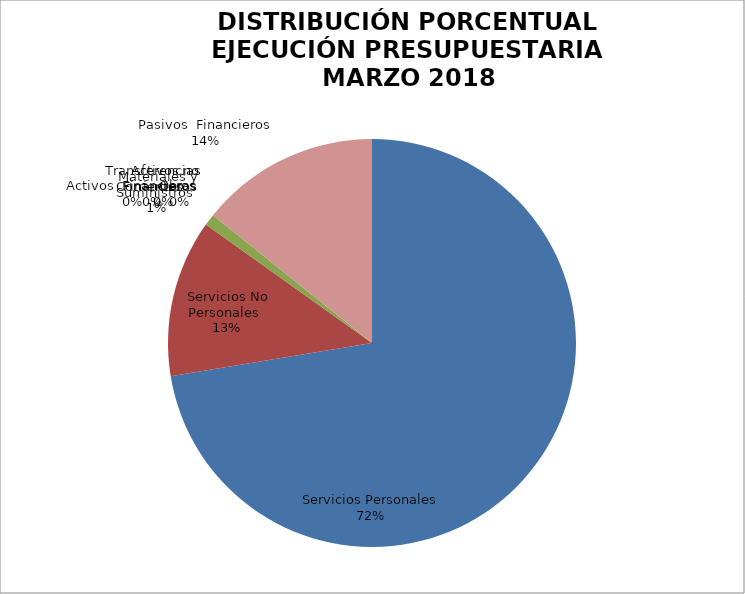
| Category | Series 0 | Series 1 |
|---|---|---|
| Servicios Personales | 22418189.93 | 0.724 |
| Servicios No Personales | 3858400.09 | 0.125 |
| Materiales y Suministros | 285642.77 | 0.009 |
| Transferencias Corrientes | 0 | 0 |
| Activos no Financieros | 0 | 0 |
| Obras | 0 | 0 |
| Activos  Financieros | 0 | 0 |
| Pasivos  Financieros | 4403728.1 | 0.142 |